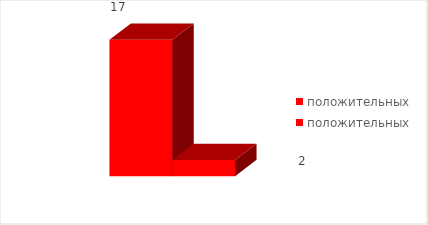
| Category | положительных |
|---|---|
| 0 | 2 |